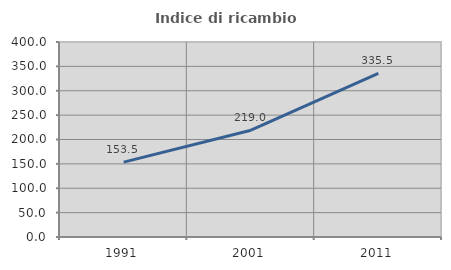
| Category | Indice di ricambio occupazionale  |
|---|---|
| 1991.0 | 153.535 |
| 2001.0 | 218.987 |
| 2011.0 | 335.526 |